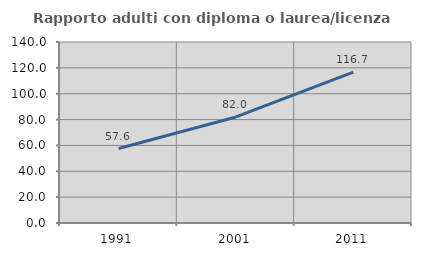
| Category | Rapporto adulti con diploma o laurea/licenza media  |
|---|---|
| 1991.0 | 57.582 |
| 2001.0 | 82.036 |
| 2011.0 | 116.71 |